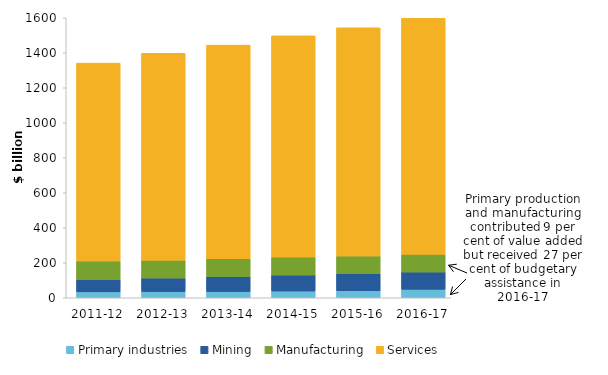
| Category | Primary industries | Mining | Manufacturing | Services |
|---|---|---|---|---|
| 2011-12 | 33.809 | 70.739 | 105.414 | 1130.963 |
| 2012-13 | 35.011 | 77.449 | 101.365 | 1183.314 |
| 2013-14 | 35.427 | 85.598 | 101.638 | 1220.912 |
| 2014-15 | 38.471 | 91.961 | 102.263 | 1264.052 |
| 2015-16 | 40.338 | 97.655 | 100.696 | 1304.083 |
| 2016-17 | 48.547 | 98.759 | 100.836 | 1348.491 |